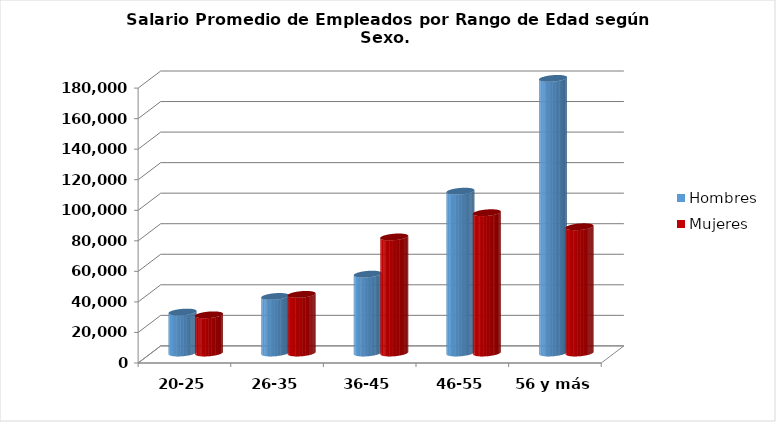
| Category | Hombres | Mujeres |
|---|---|---|
| 20-25 | 26802.857 | 24996.154 |
| 26-35 | 37034.346 | 38369.885 |
| 36-45 | 51648.025 | 75996.912 |
| 46-55 | 105968.871 | 91865.634 |
| 56 y más | 179830.24 | 82659.734 |